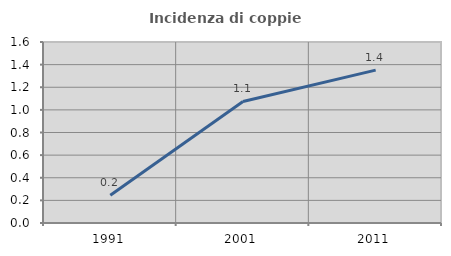
| Category | Incidenza di coppie miste |
|---|---|
| 1991.0 | 0.246 |
| 2001.0 | 1.075 |
| 2011.0 | 1.351 |